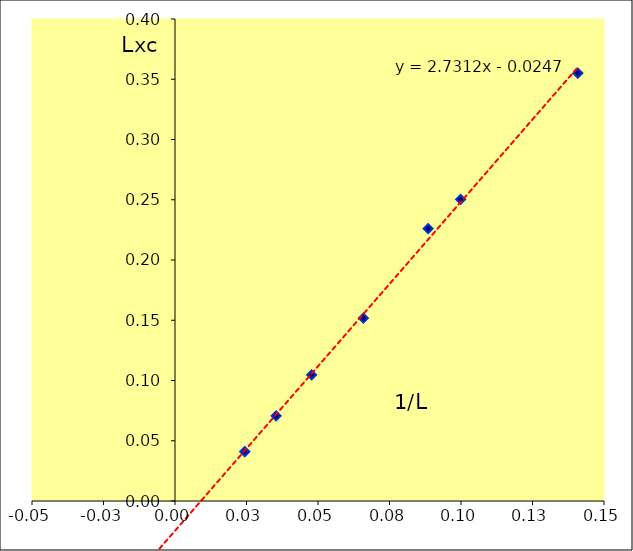
| Category | Series 0 |
|---|---|
| 0.024390243902439 | 0.041 |
| 0.0353606789250354 | 0.071 |
| 0.0477554918815664 | 0.105 |
| 0.0658761528326746 | 0.152 |
| 0.0884955752212389 | 0.226 |
| 0.0998801438274071 | 0.25 |
| 0.140845070422535 | 0.355 |